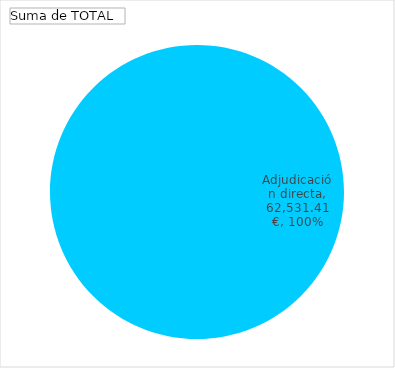
| Category | Total |
|---|---|
| Adjudicación directa | 62531.41 |